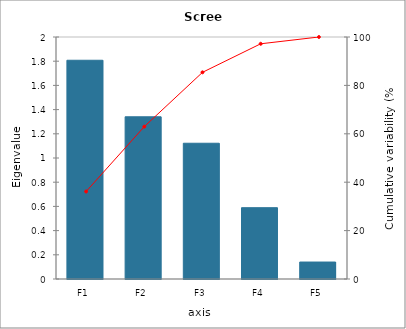
| Category | Eigenvalue |
|---|---|
| F1 | 1.808 |
| F2 | 1.341 |
| F3 | 1.122 |
| F4 | 0.589 |
| F5 | 0.14 |